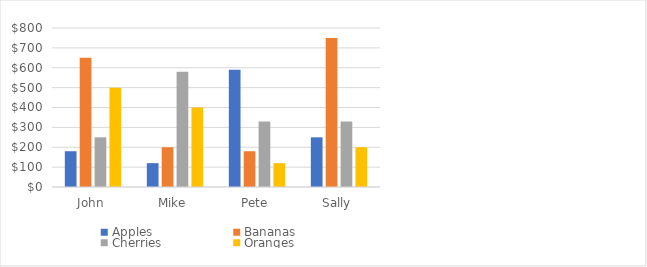
| Category | Apples | Bananas | Cherries | Oranges |
|---|---|---|---|---|
| John | 180 | 650 | 250 | 500 |
| Mike | 120 | 200 | 580 | 400 |
| Pete | 590 | 180 | 330 | 120 |
| Sally | 250 | 750 | 330 | 200 |